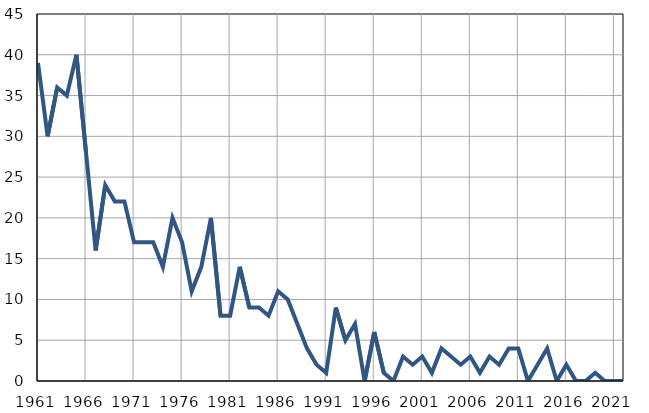
| Category | Infants
deaths |
|---|---|
| 1961.0 | 39 |
| 1962.0 | 30 |
| 1963.0 | 36 |
| 1964.0 | 35 |
| 1965.0 | 40 |
| 1966.0 | 28 |
| 1967.0 | 16 |
| 1968.0 | 24 |
| 1969.0 | 22 |
| 1970.0 | 22 |
| 1971.0 | 17 |
| 1972.0 | 17 |
| 1973.0 | 17 |
| 1974.0 | 14 |
| 1975.0 | 20 |
| 1976.0 | 17 |
| 1977.0 | 11 |
| 1978.0 | 14 |
| 1979.0 | 20 |
| 1980.0 | 8 |
| 1981.0 | 8 |
| 1982.0 | 14 |
| 1983.0 | 9 |
| 1984.0 | 9 |
| 1985.0 | 8 |
| 1986.0 | 11 |
| 1987.0 | 10 |
| 1988.0 | 7 |
| 1989.0 | 4 |
| 1990.0 | 2 |
| 1991.0 | 1 |
| 1992.0 | 9 |
| 1993.0 | 5 |
| 1994.0 | 7 |
| 1995.0 | 0 |
| 1996.0 | 6 |
| 1997.0 | 1 |
| 1998.0 | 0 |
| 1999.0 | 3 |
| 2000.0 | 2 |
| 2001.0 | 3 |
| 2002.0 | 1 |
| 2003.0 | 4 |
| 2004.0 | 3 |
| 2005.0 | 2 |
| 2006.0 | 3 |
| 2007.0 | 1 |
| 2008.0 | 3 |
| 2009.0 | 2 |
| 2010.0 | 4 |
| 2011.0 | 4 |
| 2012.0 | 0 |
| 2013.0 | 2 |
| 2014.0 | 4 |
| 2015.0 | 0 |
| 2016.0 | 2 |
| 2017.0 | 0 |
| 2018.0 | 0 |
| 2019.0 | 1 |
| 2020.0 | 0 |
| 2021.0 | 0 |
| 2022.0 | 0 |